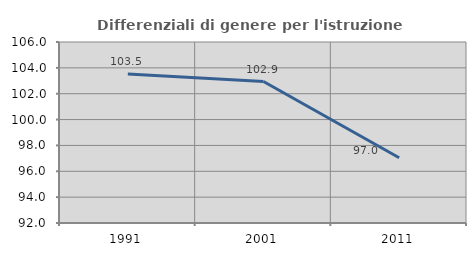
| Category | Differenziali di genere per l'istruzione superiore |
|---|---|
| 1991.0 | 103.527 |
| 2001.0 | 102.943 |
| 2011.0 | 97.046 |